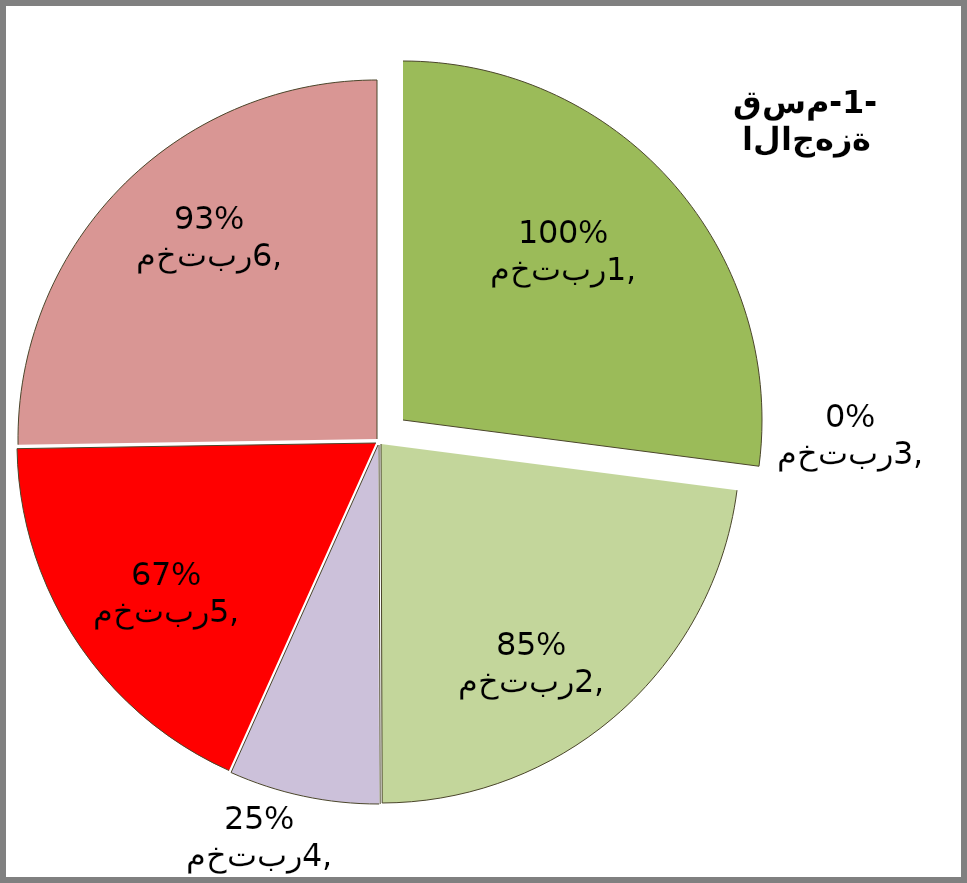
| Category | Series 2 | Series 3 | Series 1 | Series 0 |
|---|---|---|---|---|
| مختبر1 | 1 | 0.783 | 1 | 0.783 |
| مختبر2 | 0.846 | 0.867 | 0.545 | 0.867 |
| مختبر3 | 0 | 0.914 | 0.909 | 0.914 |
| مختبر4 | 0.25 | 0.8 | 0.818 | 0.8 |
| مختبر5 | 0.667 | 0.872 | 0.727 | 0.872 |
| مختبر6 | 0.933 | 0.6 | 0.455 | 0.6 |